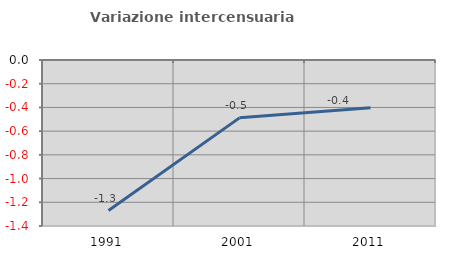
| Category | Variazione intercensuaria annua |
|---|---|
| 1991.0 | -1.27 |
| 2001.0 | -0.488 |
| 2011.0 | -0.404 |